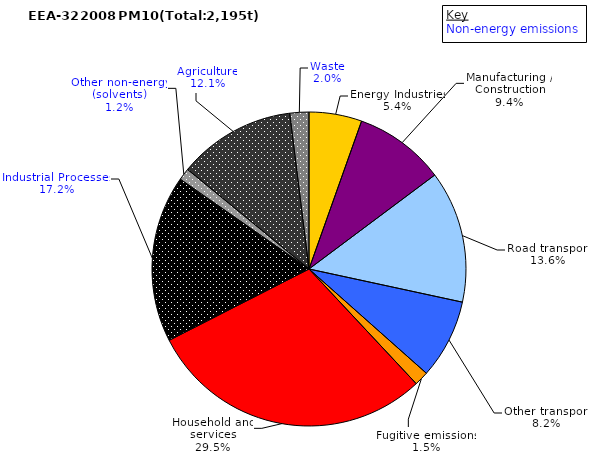
| Category | Series 0 |
|---|---|
| Energy Industries | 119.13 |
| Manufacturing / Construction | 204.893 |
| Road transport | 298.028 |
| Other transport | 179.026 |
| Fugitive emissions | 32.345 |
| Household and services | 645.445 |
| Industrial Processes | 376.905 |
| Other non-energy (solvents) | 27.105 |
| Agriculture | 265.329 |
| Waste | 42.991 |